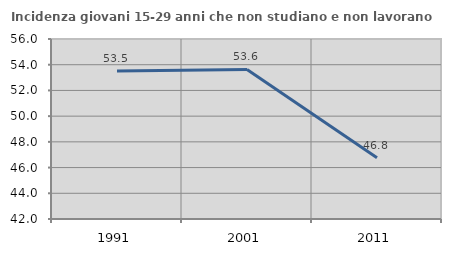
| Category | Incidenza giovani 15-29 anni che non studiano e non lavorano  |
|---|---|
| 1991.0 | 53.512 |
| 2001.0 | 53.635 |
| 2011.0 | 46.766 |